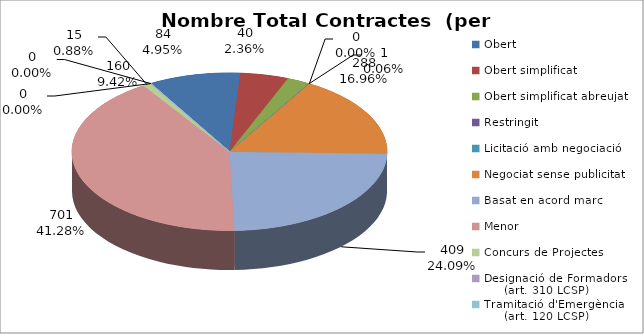
| Category | Nombre Total Contractes |
|---|---|
| Obert | 160 |
| Obert simplificat | 84 |
| Obert simplificat abreujat | 40 |
| Restringit | 1 |
| Licitació amb negociació | 0 |
| Negociat sense publicitat | 288 |
| Basat en acord marc | 409 |
| Menor | 701 |
| Concurs de Projectes | 15 |
| Designació de Formadors
     (art. 310 LCSP) | 0 |
| Tramitació d'Emergència
     (art. 120 LCSP) | 0 |